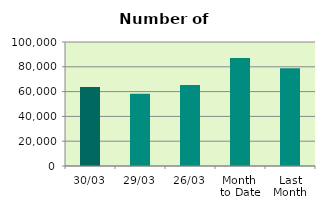
| Category | Series 0 |
|---|---|
| 30/03 | 63636 |
| 29/03 | 58302 |
| 26/03 | 65346 |
| Month 
to Date | 87084.091 |
| Last
Month | 78748.7 |